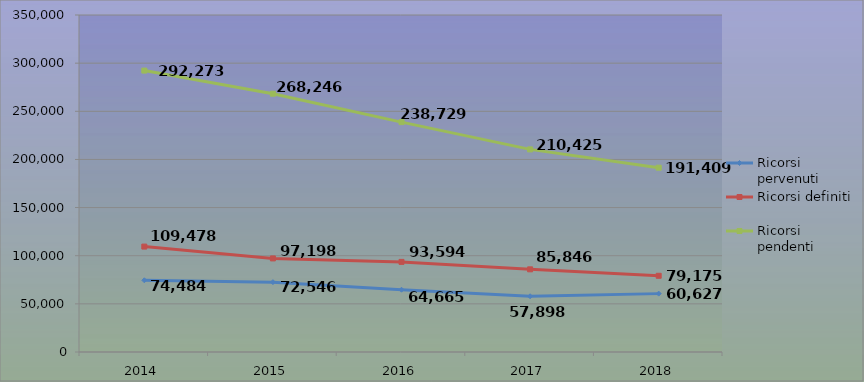
| Category | Ricorsi pervenuti | Ricorsi definiti | Ricorsi pendenti |
|---|---|---|---|
| 2014.0 | 74484 | 109478 | 292273 |
| 2015.0 | 72546 | 97198 | 268246 |
| 2016.0 | 64665 | 93594 | 238729 |
| 2017.0 | 57898 | 85846 | 210425 |
| 2018.0 | 60627 | 79175 | 191409 |